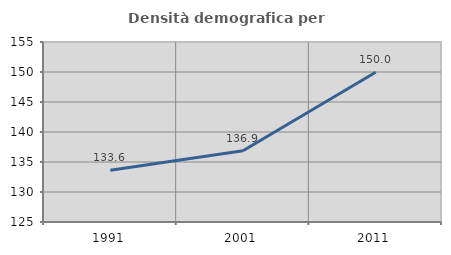
| Category | Densità demografica |
|---|---|
| 1991.0 | 133.608 |
| 2001.0 | 136.88 |
| 2011.0 | 149.966 |